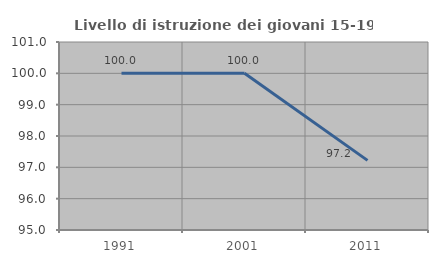
| Category | Livello di istruzione dei giovani 15-19 anni |
|---|---|
| 1991.0 | 100 |
| 2001.0 | 100 |
| 2011.0 | 97.222 |